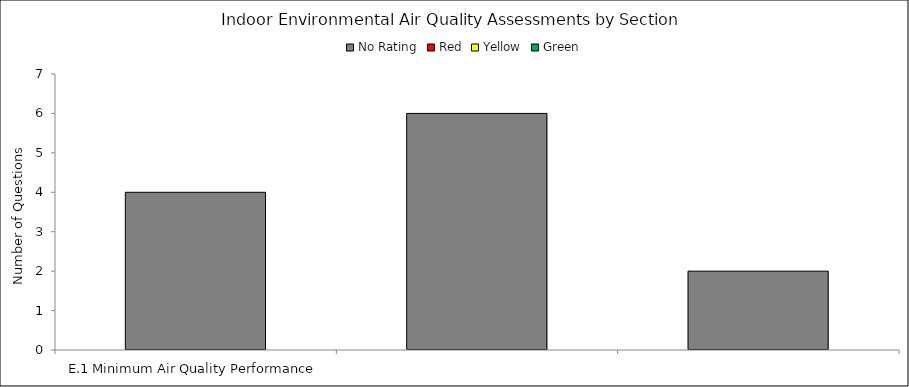
| Category | No Rating | Red | Yellow | Green |
|---|---|---|---|---|
| E.1 Minimum Air Quality Performance | 4 | 0 | 0 | 0 |
| E.2 Low-Emitting Materials | 6 | 0 | 0 | 0 |
| E.3 Moisture Control | 2 | 0 | 0 | 0 |